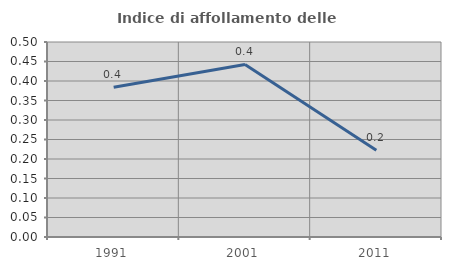
| Category | Indice di affollamento delle abitazioni  |
|---|---|
| 1991.0 | 0.384 |
| 2001.0 | 0.442 |
| 2011.0 | 0.223 |